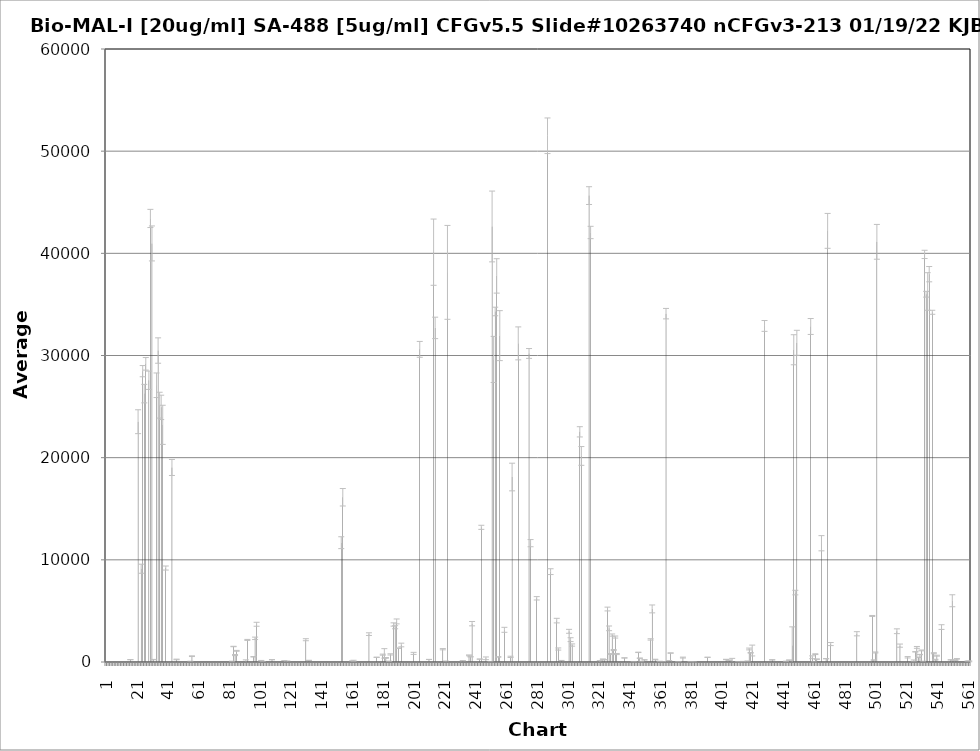
| Category | Average RFU |
|---|---|
| 1.0 | -38.25 |
| 2.0 | -140 |
| 3.0 | -43 |
| 4.0 | -93.5 |
| 5.0 | -47.75 |
| 6.0 | -127.25 |
| 7.0 | -55.75 |
| 8.0 | -92.25 |
| 9.0 | -46 |
| 10.0 | -177.75 |
| 11.0 | -101.5 |
| 12.0 | -88 |
| 13.0 | -131.25 |
| 14.0 | -89.5 |
| 15.0 | -74.25 |
| 16.0 | -104.5 |
| 17.0 | 229 |
| 18.0 | -101.25 |
| 19.0 | -29.5 |
| 20.0 | -84.25 |
| 21.0 | -102 |
| 22.0 | 23519.5 |
| 23.0 | -48.5 |
| 24.0 | 9128.5 |
| 25.0 | 28466.75 |
| 26.0 | 26269.5 |
| 27.0 | 29185.25 |
| 28.0 | -89.25 |
| 29.0 | 27576.5 |
| 30.0 | 43414 |
| 31.0 | 40968.75 |
| 32.0 | 237 |
| 33.0 | -36.75 |
| 34.0 | 27086.75 |
| 35.0 | 30484.75 |
| 36.0 | 25137.75 |
| 37.0 | 24923.25 |
| 38.0 | 23214 |
| 39.0 | -138.75 |
| 40.0 | 9197.25 |
| 41.0 | -54.75 |
| 42.0 | -101 |
| 43.0 | -65.5 |
| 44.0 | 19040.5 |
| 45.0 | -77.75 |
| 46.0 | -114 |
| 47.0 | 249 |
| 48.0 | -157.25 |
| 49.0 | -105.5 |
| 50.0 | -60.75 |
| 51.0 | -27.5 |
| 52.0 | -46.25 |
| 53.0 | -61.5 |
| 54.0 | -67.75 |
| 55.0 | -103.5 |
| 56.0 | 14.5 |
| 57.0 | 568.5 |
| 58.0 | -28 |
| 59.0 | -93.75 |
| 60.0 | -158.75 |
| 61.0 | -105.25 |
| 62.0 | -130.5 |
| 63.0 | -58.25 |
| 64.0 | -112.75 |
| 65.0 | -89.25 |
| 66.0 | -93.5 |
| 67.0 | -114 |
| 68.0 | -93.5 |
| 69.0 | -92.25 |
| 70.0 | -44 |
| 71.0 | -100.75 |
| 72.0 | -89.25 |
| 73.0 | -92 |
| 74.0 | -41.25 |
| 75.0 | -58 |
| 76.0 | -49.25 |
| 77.0 | -85 |
| 78.0 | -59 |
| 79.0 | -85.75 |
| 80.0 | -104.75 |
| 81.0 | -83.5 |
| 82.0 | -31 |
| 83.0 | 46 |
| 84.0 | 1516 |
| 85.0 | 678.5 |
| 86.0 | 1093.5 |
| 87.0 | -77.5 |
| 88.0 | -92.25 |
| 89.0 | -123.5 |
| 90.0 | -82 |
| 91.0 | -115.25 |
| 92.0 | 67 |
| 93.0 | 2161.75 |
| 94.0 | -78.5 |
| 95.0 | -111.25 |
| 96.0 | -16.25 |
| 97.0 | 510.75 |
| 98.0 | 2315.75 |
| 99.0 | 3693.5 |
| 100.0 | -59.25 |
| 101.0 | -76.5 |
| 102.0 | 134 |
| 103.0 | 21 |
| 104.0 | -67.25 |
| 105.0 | -49.75 |
| 106.0 | -51.75 |
| 107.0 | -53.5 |
| 108.0 | -81.25 |
| 109.0 | 227.5 |
| 110.0 | -56.75 |
| 111.0 | -232.25 |
| 112.0 | -71.25 |
| 113.0 | -89.75 |
| 114.0 | -56 |
| 115.0 | -131.25 |
| 116.0 | -78 |
| 117.0 | 30.5 |
| 118.0 | -85 |
| 119.0 | 23.5 |
| 120.0 | -63 |
| 121.0 | -29.75 |
| 122.0 | -71.5 |
| 123.0 | -80.25 |
| 124.0 | -72.25 |
| 125.0 | -70.25 |
| 126.0 | -66 |
| 127.0 | -80.25 |
| 128.0 | -79.25 |
| 129.0 | -73 |
| 130.0 | -90.5 |
| 131.0 | 2181 |
| 132.0 | -54 |
| 133.0 | 157.75 |
| 134.0 | -128 |
| 135.0 | -78.75 |
| 136.0 | -75.5 |
| 137.0 | -190 |
| 138.0 | -122 |
| 139.0 | -101.75 |
| 140.0 | -72.5 |
| 141.0 | -140.75 |
| 142.0 | -79.75 |
| 143.0 | -77 |
| 144.0 | -93.5 |
| 145.0 | -50 |
| 146.0 | -103.25 |
| 147.0 | -57.5 |
| 148.0 | -145 |
| 149.0 | -53.5 |
| 150.0 | -73 |
| 151.0 | -49.75 |
| 152.0 | -73.25 |
| 153.0 | -102.75 |
| 154.0 | 11678.25 |
| 155.0 | 16125.5 |
| 156.0 | -81.25 |
| 157.0 | -104 |
| 158.0 | -104.25 |
| 159.0 | -45 |
| 160.0 | -49.25 |
| 161.0 | 17.75 |
| 162.0 | 107.5 |
| 163.0 | -83.75 |
| 164.0 | -92.25 |
| 165.0 | -83 |
| 166.0 | -66.25 |
| 167.0 | -59.75 |
| 168.0 | -66.5 |
| 169.0 | -178.75 |
| 170.0 | -51.5 |
| 171.0 | -92.5 |
| 172.0 | 2727.75 |
| 173.0 | -111.75 |
| 174.0 | -64.25 |
| 175.0 | -59 |
| 176.0 | -110 |
| 177.0 | 460.5 |
| 178.0 | -117 |
| 179.0 | -169.5 |
| 180.0 | -113 |
| 181.0 | 719.25 |
| 182.0 | 840.75 |
| 183.0 | 401.75 |
| 184.0 | -129.5 |
| 185.0 | -23.25 |
| 186.0 | 744.5 |
| 187.0 | -223.5 |
| 188.0 | 3670.5 |
| 189.0 | 3402.5 |
| 190.0 | 3970.75 |
| 191.0 | 1352.75 |
| 192.0 | -95.75 |
| 193.0 | 1665 |
| 194.0 | -89.25 |
| 195.0 | -69.25 |
| 196.0 | -80.75 |
| 197.0 | -49 |
| 198.0 | -79 |
| 199.0 | -86.75 |
| 200.0 | -269.25 |
| 201.0 | 844.25 |
| 202.0 | -67 |
| 203.0 | -83.25 |
| 204.0 | -93.75 |
| 205.0 | 30602.25 |
| 206.0 | -143 |
| 207.0 | -105 |
| 208.0 | -146 |
| 209.0 | -68.25 |
| 210.0 | -62.25 |
| 211.0 | 250.5 |
| 212.0 | -79.75 |
| 213.0 | -128.25 |
| 214.0 | 40113.5 |
| 215.0 | 32701.5 |
| 216.0 | -118.5 |
| 217.0 | -63.5 |
| 218.0 | -98.25 |
| 219.0 | -147.75 |
| 220.0 | 1252 |
| 221.0 | -70.5 |
| 222.0 | 39 |
| 223.0 | 38137.25 |
| 224.0 | -88.25 |
| 225.0 | -163.5 |
| 226.0 | -106 |
| 227.0 | -163 |
| 228.0 | -61 |
| 229.0 | -47 |
| 230.0 | -155.75 |
| 231.0 | -97.75 |
| 232.0 | -125.25 |
| 233.0 | 127.25 |
| 234.0 | -127.5 |
| 235.0 | -40.75 |
| 236.0 | -109 |
| 237.0 | 650 |
| 238.0 | 508.75 |
| 239.0 | 3751.25 |
| 240.0 | -139 |
| 241.0 | -66 |
| 242.0 | -69 |
| 243.0 | -66.25 |
| 244.0 | 281.25 |
| 245.0 | 13182.25 |
| 246.0 | -121.25 |
| 247.0 | -170.5 |
| 248.0 | 362 |
| 249.0 | -156.5 |
| 250.0 | -44.75 |
| 251.0 | 7.75 |
| 252.0 | 42629 |
| 253.0 | 29613.5 |
| 254.0 | 34308.5 |
| 255.0 | 37789.5 |
| 256.0 | 496 |
| 257.0 | 31944.5 |
| 258.0 | -35.25 |
| 259.0 | -129 |
| 260.0 | 3150.75 |
| 261.0 | -108.75 |
| 262.0 | -110.25 |
| 263.0 | -85.5 |
| 264.0 | 502.25 |
| 265.0 | 18105.5 |
| 266.0 | -77.75 |
| 267.0 | -98.25 |
| 268.0 | -101.5 |
| 269.0 | 31186 |
| 270.0 | -78.25 |
| 271.0 | -128 |
| 272.0 | -27 |
| 273.0 | -64.25 |
| 274.0 | -99.25 |
| 275.0 | -85.75 |
| 276.0 | 30199.5 |
| 277.0 | 11633 |
| 278.0 | -85.75 |
| 279.0 | -46.75 |
| 280.0 | -72.75 |
| 281.0 | 6234.75 |
| 282.0 | -101 |
| 283.0 | -59.25 |
| 284.0 | -57.5 |
| 285.0 | -78 |
| 286.0 | -83 |
| 287.0 | -94.25 |
| 288.0 | 51507.25 |
| 289.0 | -90.75 |
| 290.0 | 8842.75 |
| 291.0 | -74.75 |
| 292.0 | -90.75 |
| 293.0 | -110.75 |
| 294.0 | 4051.5 |
| 295.0 | 1270.75 |
| 296.0 | -99.25 |
| 297.0 | 147.25 |
| 298.0 | -77.25 |
| 299.0 | -100.75 |
| 300.0 | -98 |
| 301.0 | -40.5 |
| 302.0 | 3003 |
| 303.0 | 2188 |
| 304.0 | 1660.5 |
| 305.0 | -64.25 |
| 306.0 | -75.5 |
| 307.0 | -108.5 |
| 308.0 | -112 |
| 309.0 | 22529.75 |
| 310.0 | 20169 |
| 311.0 | -109.75 |
| 312.0 | -109.75 |
| 313.0 | -79.5 |
| 314.0 | -46 |
| 315.0 | 45651.25 |
| 316.0 | 42041 |
| 317.0 | -55.5 |
| 318.0 | -126.75 |
| 319.0 | -211.75 |
| 320.0 | -76 |
| 321.0 | -80 |
| 322.0 | 5.25 |
| 323.0 | -94.5 |
| 324.0 | 277 |
| 325.0 | 223.25 |
| 326.0 | -14.5 |
| 327.0 | 5184.75 |
| 328.0 | 3295.25 |
| 329.0 | 782.75 |
| 330.0 | 2637 |
| 331.0 | 1170.5 |
| 332.0 | 2442.25 |
| 333.0 | 780.5 |
| 334.0 | -86.25 |
| 335.0 | -116.75 |
| 336.0 | -95.25 |
| 337.0 | -73.25 |
| 338.0 | 399.25 |
| 339.0 | -70.25 |
| 340.0 | -34 |
| 341.0 | -20.75 |
| 342.0 | -150.75 |
| 343.0 | -50.25 |
| 344.0 | 15.25 |
| 345.0 | -26.75 |
| 346.0 | -84.5 |
| 347.0 | 943.25 |
| 348.0 | 372.75 |
| 349.0 | -4 |
| 350.0 | -132 |
| 351.0 | 208.5 |
| 352.0 | -102.75 |
| 353.0 | -99.5 |
| 354.0 | -39.75 |
| 355.0 | 2211 |
| 356.0 | 5194.75 |
| 357.0 | -49 |
| 358.0 | 242.5 |
| 359.0 | -31.5 |
| 360.0 | -123 |
| 361.0 | 46.5 |
| 362.0 | -33 |
| 363.0 | 44 |
| 364.0 | -44.25 |
| 365.0 | 34095 |
| 366.0 | -115.5 |
| 367.0 | 126 |
| 368.0 | 875.75 |
| 369.0 | -91.25 |
| 370.0 | -82.25 |
| 371.0 | -32.75 |
| 372.0 | -35.75 |
| 373.0 | 23 |
| 374.0 | -99 |
| 375.0 | -31.5 |
| 376.0 | 432.75 |
| 377.0 | -56.25 |
| 378.0 | -105.75 |
| 379.0 | -80.75 |
| 380.0 | -113.75 |
| 381.0 | 35.5 |
| 382.0 | -57.5 |
| 383.0 | -2.5 |
| 384.0 | -268.5 |
| 385.0 | -84.25 |
| 386.0 | -50 |
| 387.0 | -193.75 |
| 388.0 | -23.25 |
| 389.0 | -60.75 |
| 390.0 | -49.75 |
| 391.0 | -69 |
| 392.0 | 460.75 |
| 393.0 | -97.25 |
| 394.0 | -71 |
| 395.0 | -113.5 |
| 396.0 | -108.25 |
| 397.0 | -65.25 |
| 398.0 | -43.25 |
| 399.0 | -80.75 |
| 400.0 | -80 |
| 401.0 | -105.75 |
| 402.0 | -82.25 |
| 403.0 | -119.25 |
| 404.0 | 247.25 |
| 405.0 | -47.5 |
| 406.0 | 176 |
| 407.0 | -121.75 |
| 408.0 | 80.75 |
| 409.0 | -95 |
| 410.0 | -60.5 |
| 411.0 | -135.5 |
| 412.0 | 34.75 |
| 413.0 | -111 |
| 414.0 | 22.75 |
| 415.0 | 47.75 |
| 416.0 | -71.25 |
| 417.0 | -73 |
| 418.0 | 54.75 |
| 419.0 | 1274.25 |
| 420.0 | 898.75 |
| 421.0 | 1123.5 |
| 422.0 | -127 |
| 423.0 | -75.75 |
| 424.0 | -115.25 |
| 425.0 | -90.25 |
| 426.0 | -109 |
| 427.0 | -98 |
| 428.0 | -108.75 |
| 429.0 | 32893.25 |
| 430.0 | -91.5 |
| 431.0 | -162.5 |
| 432.0 | -262.5 |
| 433.0 | -170.75 |
| 434.0 | 210.5 |
| 435.0 | -62.75 |
| 436.0 | -35.75 |
| 437.0 | -87.25 |
| 438.0 | -62.25 |
| 439.0 | -111.5 |
| 440.0 | -68 |
| 441.0 | -60 |
| 442.0 | -18.5 |
| 443.0 | 61.75 |
| 444.0 | -107.25 |
| 445.0 | 184.25 |
| 446.0 | -164 |
| 447.0 | 1625 |
| 448.0 | 30562.5 |
| 449.0 | 6795.25 |
| 450.0 | 31243.5 |
| 451.0 | -117.25 |
| 452.0 | -146.25 |
| 453.0 | -120 |
| 454.0 | -142.75 |
| 455.0 | -135.25 |
| 456.0 | -58.75 |
| 457.0 | -70.25 |
| 458.0 | -27 |
| 459.0 | 32840 |
| 460.0 | 463.75 |
| 461.0 | -31 |
| 462.0 | 767.5 |
| 463.0 | 279 |
| 464.0 | -83.5 |
| 465.0 | -18.5 |
| 466.0 | 11624.25 |
| 467.0 | -64.75 |
| 468.0 | -112.25 |
| 469.0 | 323.75 |
| 470.0 | 42198.25 |
| 471.0 | -68.75 |
| 472.0 | 1756.75 |
| 473.0 | -67.25 |
| 474.0 | -159.75 |
| 475.0 | -135.25 |
| 476.0 | -188.5 |
| 477.0 | -26.75 |
| 478.0 | -78.25 |
| 479.0 | -97 |
| 480.0 | -35.75 |
| 481.0 | -126.25 |
| 482.0 | -116 |
| 483.0 | -108 |
| 484.0 | -107 |
| 485.0 | -112.25 |
| 486.0 | -52.75 |
| 487.0 | -87.5 |
| 488.0 | -36.25 |
| 489.0 | 2763 |
| 490.0 | -84 |
| 491.0 | -92 |
| 492.0 | -110.75 |
| 493.0 | -298.5 |
| 494.0 | -90 |
| 495.0 | -178.25 |
| 496.0 | -84 |
| 497.0 | -265.25 |
| 498.0 | -170.5 |
| 499.0 | 4506.25 |
| 500.0 | 188 |
| 501.0 | 932.5 |
| 502.0 | 41126 |
| 503.0 | -77.5 |
| 504.0 | -84.5 |
| 505.0 | -85 |
| 506.0 | -100.25 |
| 507.0 | -34.25 |
| 508.0 | -190.75 |
| 509.0 | -46 |
| 510.0 | -157.25 |
| 511.0 | -24.25 |
| 512.0 | -119.5 |
| 513.0 | -128.25 |
| 514.0 | -99.25 |
| 515.0 | 3010.25 |
| 516.0 | -91.25 |
| 517.0 | 1602.5 |
| 518.0 | -58.25 |
| 519.0 | -88.25 |
| 520.0 | -84 |
| 521.0 | -42 |
| 522.0 | 463.25 |
| 523.0 | -101 |
| 524.0 | -115.25 |
| 525.0 | -71.5 |
| 526.0 | 110.75 |
| 527.0 | 997 |
| 528.0 | 1430 |
| 529.0 | 461.25 |
| 530.0 | 731 |
| 531.0 | 1132.25 |
| 532.0 | 23.25 |
| 533.0 | 39894.5 |
| 534.0 | 35996.25 |
| 535.0 | 36265.25 |
| 536.0 | 37960.5 |
| 537.0 | -134.75 |
| 538.0 | 34230 |
| 539.0 | 857.5 |
| 540.0 | 227.5 |
| 541.0 | 618.5 |
| 542.0 | -74.75 |
| 543.0 | -115.25 |
| 544.0 | 3419 |
| 545.0 | -142.75 |
| 546.0 | -115 |
| 547.0 | -133.75 |
| 548.0 | -89.25 |
| 549.0 | -40.75 |
| 550.0 | 210.75 |
| 551.0 | 5994.25 |
| 552.0 | 144 |
| 553.0 | 184.25 |
| 554.0 | 309 |
| 555.0 | -71.75 |
| 556.0 | -137.25 |
| 557.0 | -40.75 |
| 558.0 | -110 |
| 559.0 | -115.75 |
| 560.0 | -146 |
| 561.0 | -6.25 |
| 562.0 | 62.75 |